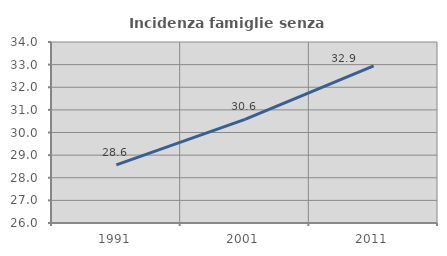
| Category | Incidenza famiglie senza nuclei |
|---|---|
| 1991.0 | 28.571 |
| 2001.0 | 30.579 |
| 2011.0 | 32.941 |